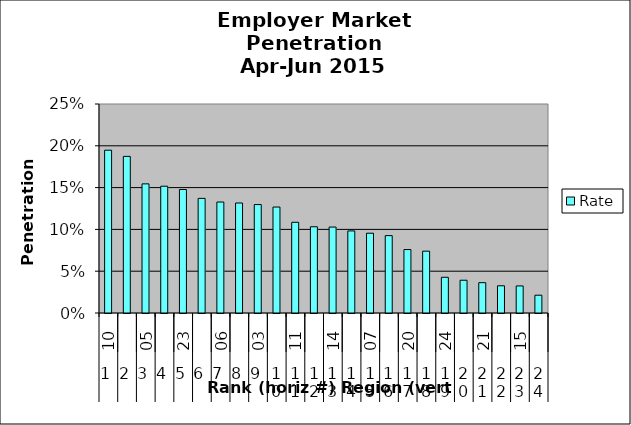
| Category | Rate |
|---|---|
| 0 | 0.195 |
| 1 | 0.187 |
| 2 | 0.154 |
| 3 | 0.152 |
| 4 | 0.148 |
| 5 | 0.137 |
| 6 | 0.133 |
| 7 | 0.132 |
| 8 | 0.13 |
| 9 | 0.127 |
| 10 | 0.109 |
| 11 | 0.103 |
| 12 | 0.103 |
| 13 | 0.098 |
| 14 | 0.095 |
| 15 | 0.093 |
| 16 | 0.076 |
| 17 | 0.074 |
| 18 | 0.043 |
| 19 | 0.039 |
| 20 | 0.036 |
| 21 | 0.033 |
| 22 | 0.032 |
| 23 | 0.021 |